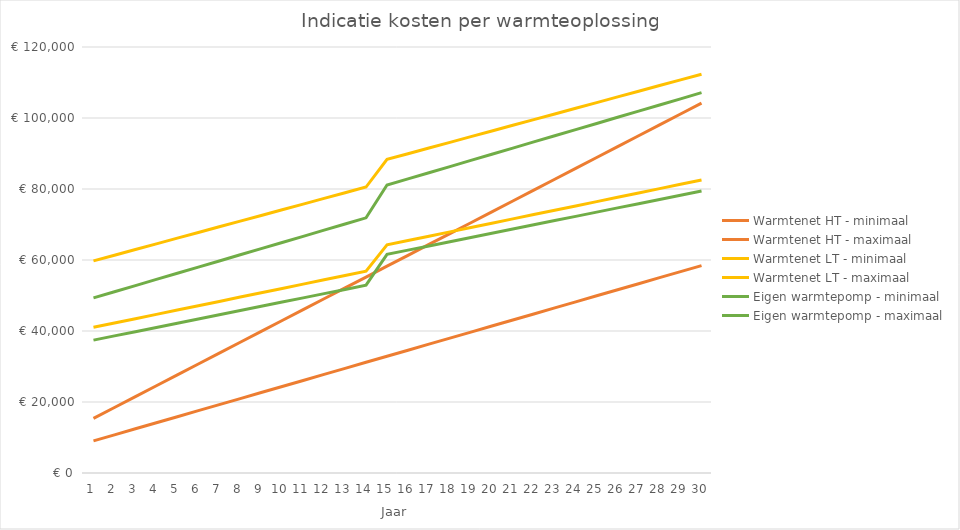
| Category | Warmtenet HT - minimaal | Warmtenet HT - maximaal | Warmtenet LT - minimaal | Warmtenet LT - maximaal | Eigen warmtepomp - minimaal | Eigen warmtepomp - maximaal |
|---|---|---|---|---|---|---|
| 0 | 9040.487 | 15398.802 | 41031.624 | 59751.928 | 37436.42 | 49319.98 |
| 1 | 10743.584 | 18460.215 | 42249.015 | 61351.623 | 38625.995 | 51055.116 |
| 2 | 12446.68 | 21521.627 | 43466.405 | 62951.318 | 39815.571 | 52790.252 |
| 3 | 14149.777 | 24583.039 | 44683.796 | 64551.012 | 41005.147 | 54525.388 |
| 4 | 15852.874 | 27644.452 | 45901.186 | 66150.707 | 42194.723 | 56260.524 |
| 5 | 17555.971 | 30705.864 | 47118.577 | 67750.402 | 43384.299 | 57995.66 |
| 6 | 19259.068 | 33767.276 | 48335.967 | 69350.097 | 44573.875 | 59730.796 |
| 7 | 20962.164 | 36828.689 | 49553.358 | 70949.791 | 45763.451 | 61465.932 |
| 8 | 22665.261 | 39890.101 | 50770.748 | 72549.486 | 46953.026 | 63201.068 |
| 9 | 24368.358 | 42951.513 | 51988.139 | 74149.181 | 48142.602 | 64936.204 |
| 10 | 26071.455 | 46012.926 | 53205.529 | 75748.875 | 49332.178 | 66671.34 |
| 11 | 27774.552 | 49074.338 | 54422.92 | 77348.57 | 50521.754 | 68406.476 |
| 12 | 29477.648 | 52135.75 | 55640.311 | 78948.265 | 51711.33 | 70141.612 |
| 13 | 31180.745 | 55197.162 | 56857.701 | 80547.96 | 52900.906 | 71876.748 |
| 14 | 32883.842 | 58258.575 | 64275.092 | 88347.654 | 61590.482 | 81111.884 |
| 15 | 34586.939 | 61319.987 | 65492.482 | 89947.349 | 62780.057 | 82847.02 |
| 16 | 36290.036 | 64381.399 | 66709.873 | 91547.044 | 63969.633 | 84582.156 |
| 17 | 37993.132 | 67442.812 | 67927.263 | 93146.738 | 65159.209 | 86317.292 |
| 18 | 39696.229 | 70504.224 | 69144.654 | 94746.433 | 66348.785 | 88052.428 |
| 19 | 41399.326 | 73565.636 | 70362.044 | 96346.128 | 67538.361 | 89787.564 |
| 20 | 43102.423 | 76627.049 | 71579.435 | 97945.822 | 68727.937 | 91522.7 |
| 21 | 44805.52 | 79688.461 | 72796.825 | 99545.517 | 69917.513 | 93257.836 |
| 22 | 46508.616 | 82749.873 | 74014.216 | 101145.212 | 71107.088 | 94992.972 |
| 23 | 48211.713 | 85811.286 | 75231.606 | 102744.907 | 72296.664 | 96728.109 |
| 24 | 49914.81 | 88872.698 | 76448.997 | 104344.601 | 73486.24 | 98463.245 |
| 25 | 51617.907 | 91934.11 | 77666.387 | 105944.296 | 74675.816 | 100198.381 |
| 26 | 53321.004 | 94995.523 | 78883.778 | 107543.991 | 75865.392 | 101933.517 |
| 27 | 55024.1 | 98056.935 | 80101.168 | 109143.685 | 77054.968 | 103668.653 |
| 28 | 56727.197 | 101118.347 | 81318.559 | 110743.38 | 78244.544 | 105403.789 |
| 29 | 58430.294 | 104179.76 | 82535.949 | 112343.075 | 79434.119 | 107138.925 |